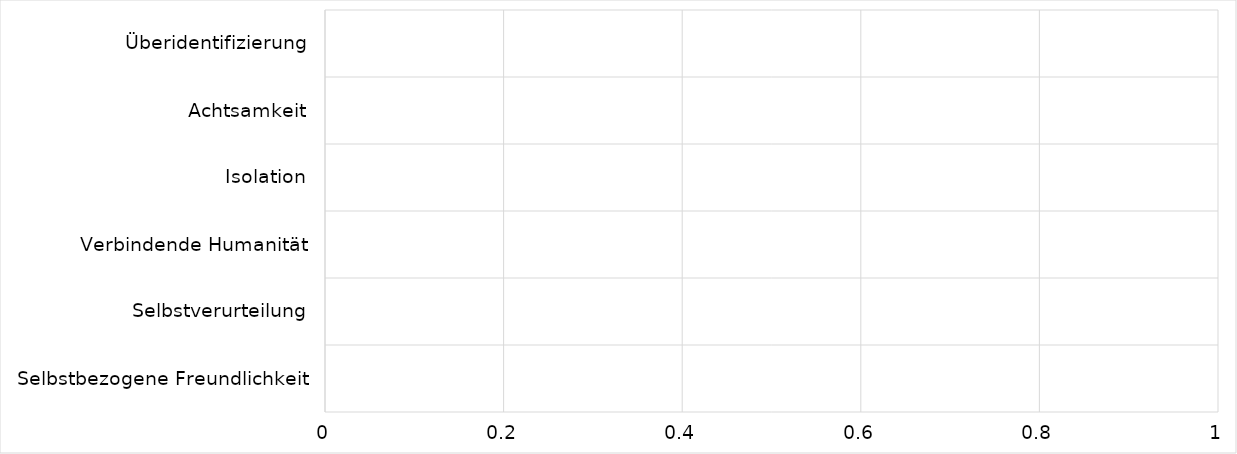
| Category | Series 0 |
|---|---|
|  Selbstbezogene Freundlichkeit | 0 |
|  Selbstverurteilung | 0 |
|  Verbindende Humanität | 0 |
|  Isolation | 0 |
|  Achtsamkeit | 0 |
|  Überidentifizierung | 0 |